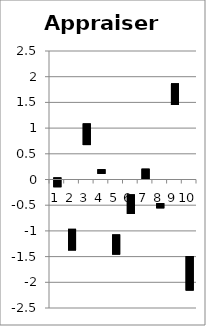
| Category | Series 0 | Series 1 | Series 2 |
|---|---|---|---|
| 0 | 0.04 | -0.11 | -0.15 |
| 1 | -1.38 | -1.13 | -0.96 |
| 2 | 0.88 | 1.09 | 0.67 |
| 3 | 0.14 | 0.2 | 0.11 |
| 4 | -1.46 | -1.07 | -1.45 |
| 5 | -0.29 | -0.67 | -0.49 |
| 6 | 0.02 | 0.01 | 0.21 |
| 7 | -0.46 | -0.56 | -0.49 |
| 8 | 1.77 | 1.45 | 1.87 |
| 9 | -1.49 | -1.77 | -2.16 |